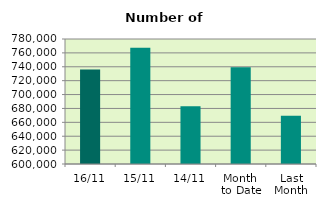
| Category | Series 0 |
|---|---|
| 16/11 | 735920 |
| 15/11 | 767564 |
| 14/11 | 682994 |
| Month 
to Date | 739230.667 |
| Last
Month | 669366.857 |